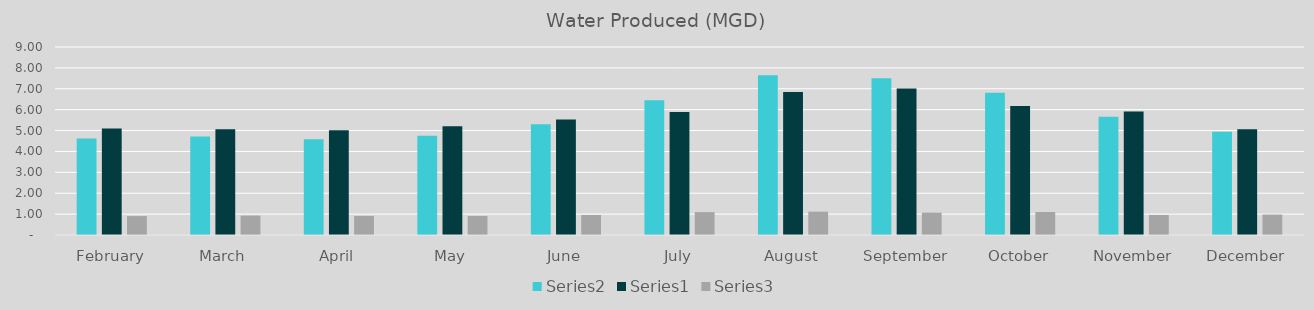
| Category | Series 1 | Series 0 | Series 2 |
|---|---|---|---|
| February | 4.62 | 5.1 | 0.906 |
| March | 4.71 | 5.06 | 0.931 |
| April | 4.58 | 5.01 | 0.914 |
| May | 4.75 | 5.21 | 0.912 |
| June | 5.3 | 5.53 | 0.958 |
| July | 6.45 | 5.89 | 1.095 |
| August | 7.65 | 6.85 | 1.117 |
| September | 7.5 | 7.01 | 1.07 |
| October | 6.81 | 6.18 | 1.102 |
| November | 5.66 | 5.91 | 0.958 |
| December | 4.94 | 5.06 | 0.976 |